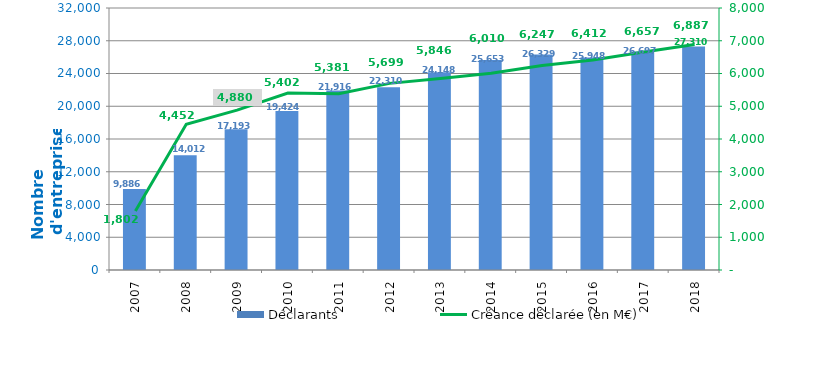
| Category | Déclarants |
|---|---|
| 2007.0 | 9886 |
| 2008.0 | 14012 |
| 2009.0 | 17193 |
| 2010.0 | 19424 |
| 2011.0 | 21916 |
| 2012.0 | 22310 |
| 2013.0 | 24148 |
| 2014.0 | 25653 |
| 2015.0 | 26329 |
| 2016.0 | 25948 |
| 2017.0 | 26697 |
| 2018.0 | 27310 |